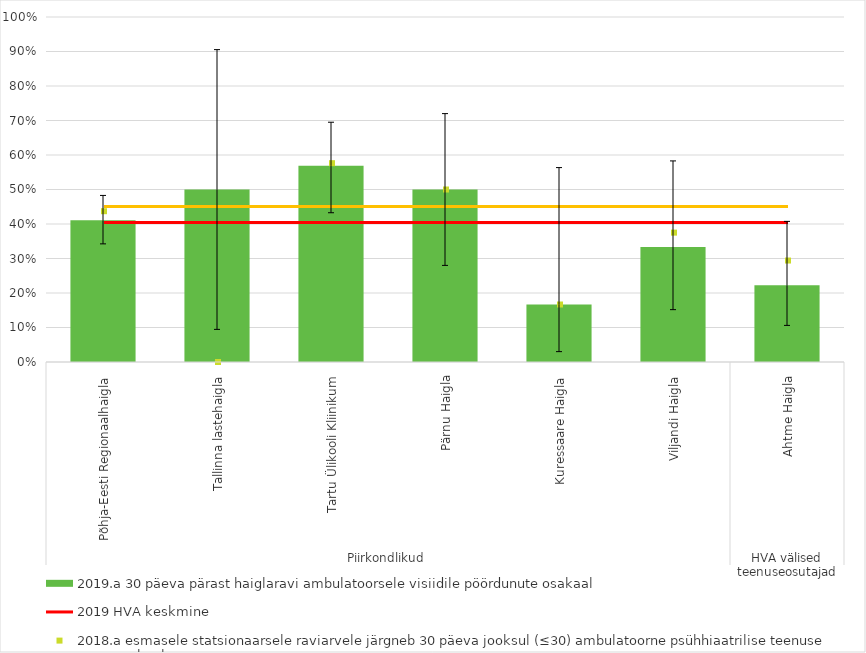
| Category | 2019.a 30 päeva pärast haiglaravi ambulatoorsele visiidile pöördunute osakaal |
|---|---|
| 0 | 0.411 |
| 1 | 0.5 |
| 2 | 0.569 |
| 3 | 0.5 |
| 4 | 0.167 |
| 5 | 0.333 |
| 6 | 0.222 |